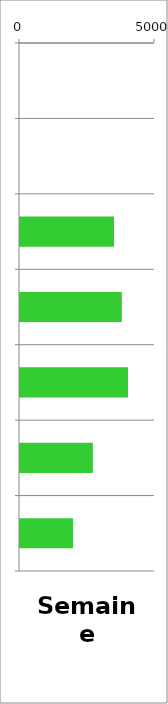
| Category | VL |
|---|---|
| 0 | 0 |
| 1 | 0 |
| 2 | 3482 |
| 3 | 3772 |
| 4 | 4000 |
| 5 | 2698 |
| 6 | 1962 |